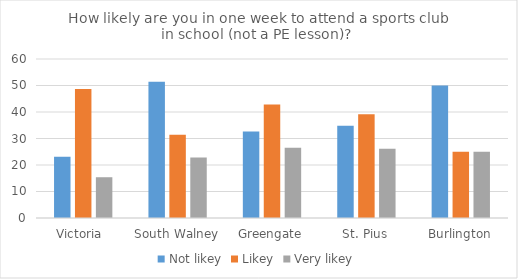
| Category | Not likey | Likey | Very likey |
|---|---|---|---|
| Victoria  | 23.077 | 48.718 | 15.385 |
| South Walney | 51.429 | 31.429 | 22.857 |
| Greengate | 32.653 | 42.857 | 26.531 |
| St. Pius | 34.783 | 39.13 | 26.087 |
| Burlington | 50 | 25 | 25 |